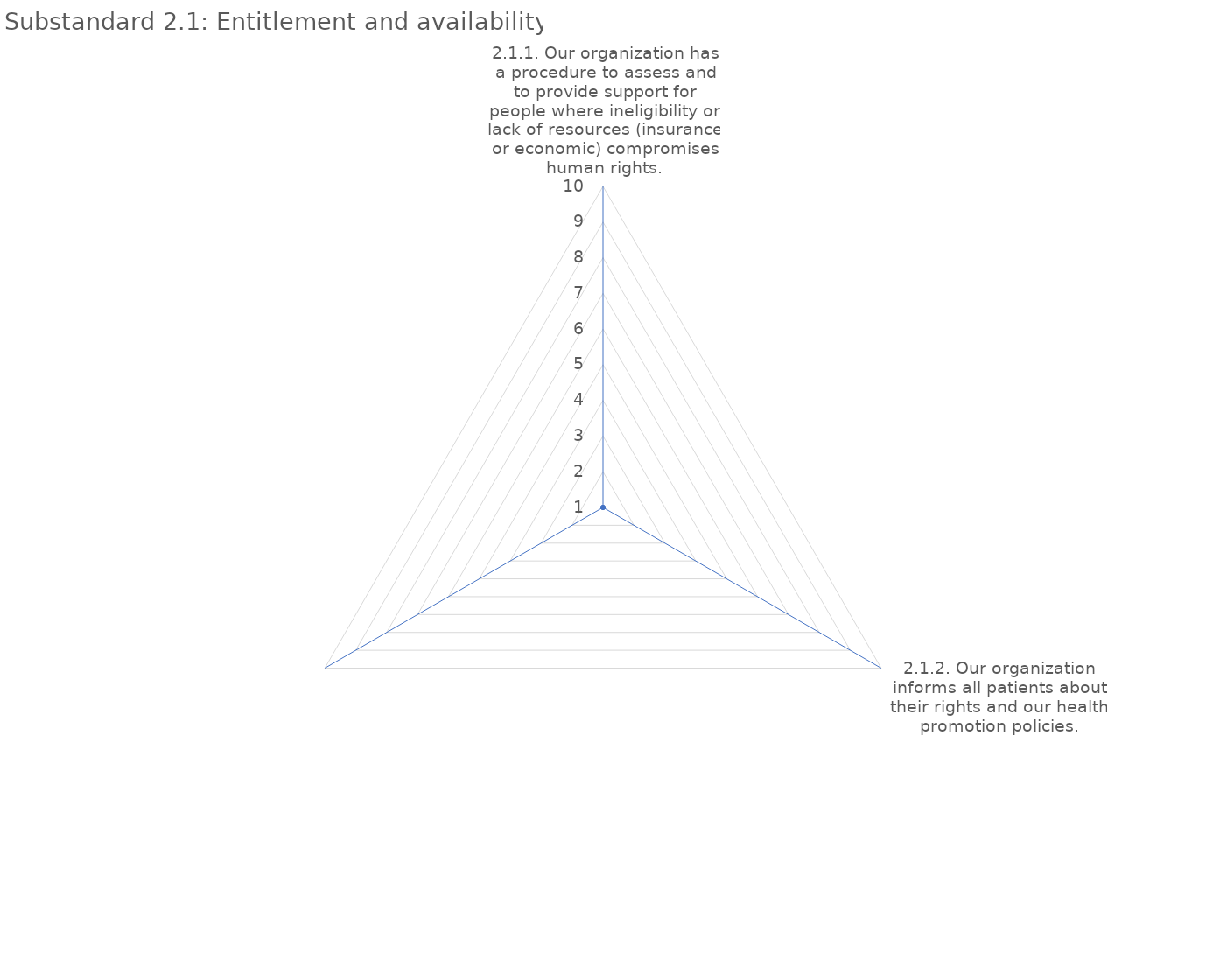
| Category | value |
|---|---|
| 2.1.1. Our organization has a procedure to assess and to provide support for people where ineligibility or lack of resources (insurance or economic) compromises human rights. | 1 |
| 2.1.2. Our organization informs all patients about their rights and our health promotion policies. | 1 |